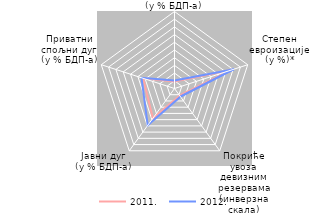
| Category | 2011. | 2012. |
|---|---|---|
| Дефицит платног биланса
(у % БДП-a) | 9.217 | 10.505 |
| Степен
евроизације
(у %)* | 78.936 | 81.15 |
| Покриће увоза девизним резервама
(инверзна скала) | 11.491 | 13.141 |
| Јавни дуг
(у % БДП-a) | 47.678 | 59.161 |
| Приватни
спољни дуг
(у % БДП-a) | 42.878 | 45.062 |